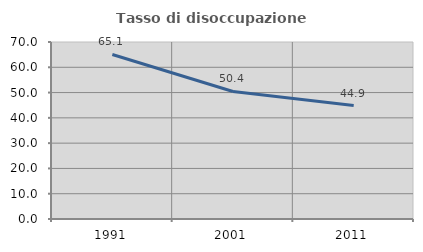
| Category | Tasso di disoccupazione giovanile  |
|---|---|
| 1991.0 | 65.066 |
| 2001.0 | 50.43 |
| 2011.0 | 44.872 |